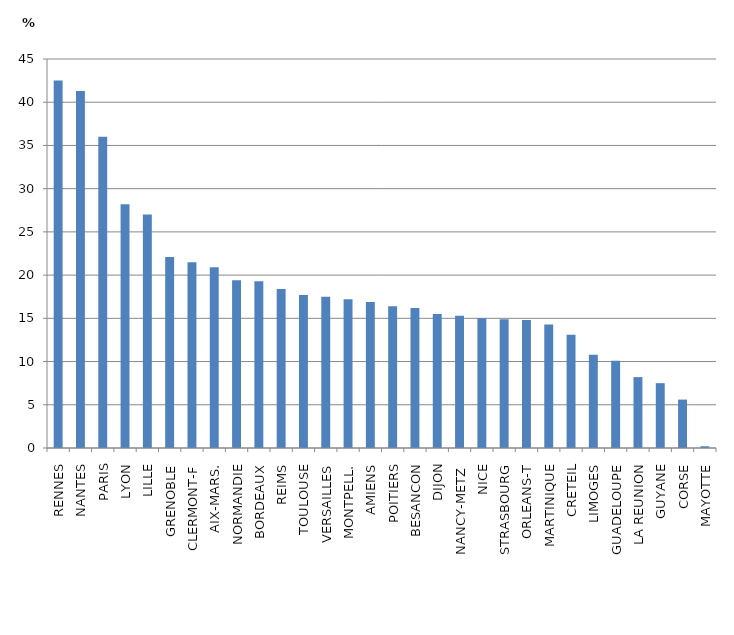
| Category | Part du secteur privé sous contrat dans le second degré |
|---|---|
| RENNES | 42.5 |
| NANTES | 41.3 |
| PARIS | 36 |
| LYON | 28.2 |
| LILLE | 27 |
| GRENOBLE | 22.1 |
| CLERMONT-F | 21.5 |
| AIX-MARS. | 20.9 |
| NORMANDIE | 19.4 |
| BORDEAUX | 19.3 |
| REIMS | 18.4 |
| TOULOUSE | 17.7 |
| VERSAILLES | 17.5 |
| MONTPELL. | 17.2 |
| AMIENS | 16.9 |
| POITIERS | 16.4 |
| BESANCON | 16.2 |
| DIJON | 15.5 |
| NANCY-METZ  | 15.3 |
| NICE | 15 |
| STRASBOURG | 14.9 |
| ORLEANS-T | 14.8 |
| MARTINIQUE | 14.3 |
| CRETEIL | 13.1 |
| LIMOGES | 10.8 |
| GUADELOUPE | 10.1 |
| LA REUNION | 8.2 |
| GUYANE | 7.5 |
| CORSE | 5.6 |
| MAYOTTE | 0.2 |